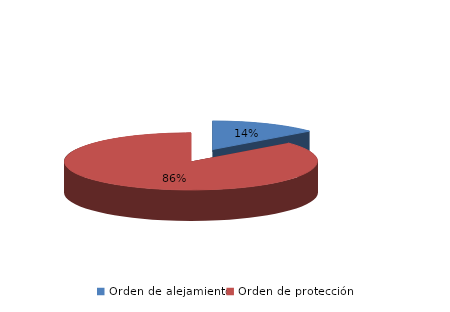
| Category | Series 0 |
|---|---|
| Orden de alejamiento | 13 |
| Orden de protección | 81 |